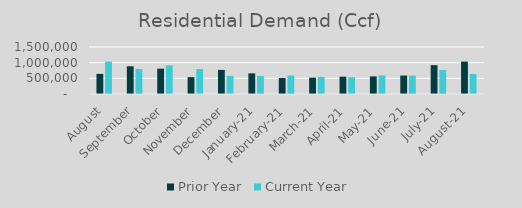
| Category | Prior Year | Current Year |
|---|---|---|
| August | 641515.25 | 1034271.241 |
| September | 884745.885 | 795392.365 |
| October | 808030.57 | 913450.318 |
| November | 537591.016 | 796803.85 |
| December | 768795.205 | 575698.992 |
| January-21 | 659359.876 | 574964.407 |
| February-21 | 510296.309 | 591912.627 |
| March-21 | 521598.856 | 545392.69 |
| April-21 | 552550.404 | 533967.423 |
| May-21 | 561680.927 | 591911.753 |
| June-21 | 588815.728 | 587861.265 |
| July-21 | 920418.723 | 764849.567 |
| August-21 | 1034271.241 | 637451.79 |